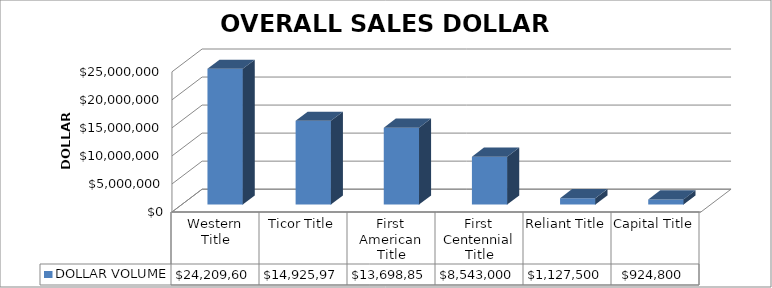
| Category | DOLLAR VOLUME |
|---|---|
| Western Title | 24209600 |
| Ticor Title | 14925974.15 |
| First American Title | 13698850 |
| First Centennial Title | 8543000 |
| Reliant Title | 1127500 |
| Capital Title | 924800 |